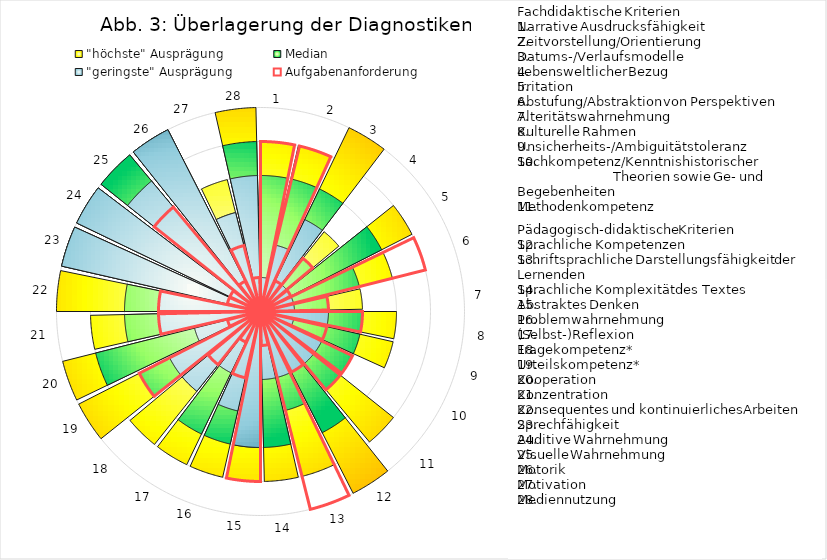
| Category | Series 3 |
|---|---|
| 1_x000d_ | 6 |
| 2_x000d_ | 6 |
| 3_x000d_ | 6 |
| 4_x000d_ | 6 |
| 5_x000d_ | 6 |
| 6_x000d_ | 6 |
| 7_x000d_ | 6 |
| 8 | 6 |
| 9_x000d_ | 6 |
| 10_x000d_ | 6 |
| 11_x000d_ | 6 |
| 12_x000d_ | 6 |
| 13_x000d_ | 6 |
| 14_x000d_ | 6 |
| 15_x000d_ | 6 |
| 16_x000d_ | 6 |
| 17_x000d_ | 6 |
| 18_x000d_ | 6 |
| 19_x000d_ | 6 |
| 20_x000d_ | 6 |
| 21_x000d_ | 6 |
| 22_x000d_ | 6 |
| 23_x000d_ | 6 |
| 24_x000d_ | 6 |
| 25_x000d_ | 6 |
| 26_x000d_ | 6 |
| 27_x000d_ | 6 |
| 28_x000d_ | 6 |